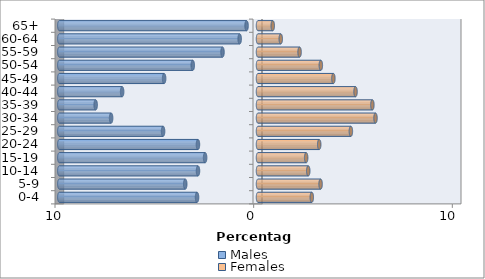
| Category | Males | Females |
|---|---|---|
| 0-4 | -3.068 | 2.707 |
| 5-9 | -3.663 | 3.151 |
| 10-14 | -3.021 | 2.53 |
| 15-19 | -2.662 | 2.425 |
| 20-24 | -3.022 | 3.081 |
| 25-29 | -4.778 | 4.675 |
| 30-34 | -7.394 | 5.915 |
| 35-39 | -8.172 | 5.758 |
| 40-44 | -6.839 | 4.91 |
| 45-49 | -4.725 | 3.795 |
| 50-54 | -3.284 | 3.163 |
| 55-59 | -1.787 | 2.093 |
| 60-64 | -0.922 | 1.145 |
| 65+ | -0.575 | 0.742 |